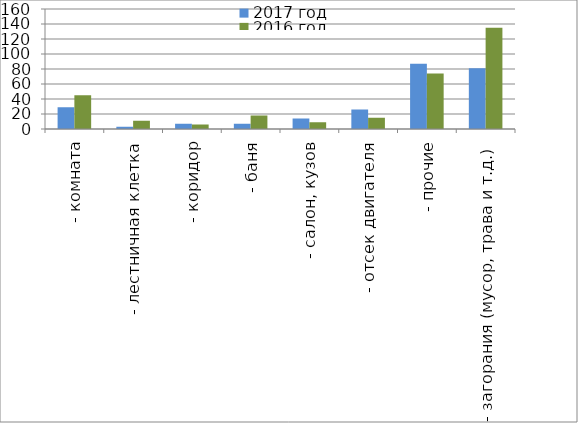
| Category | 2017 год | 2016 год |
|---|---|---|
|  - комната | 29 | 45 |
|  - лестничная клетка | 3 | 11 |
|  - коридор | 7 | 6 |
|  - баня | 7 | 18 |
|  - салон, кузов | 14 | 9 |
|  - отсек двигателя | 26 | 15 |
| - прочие | 87 | 74 |
| - загорания (мусор, трава и т.д.)  | 81 | 135 |